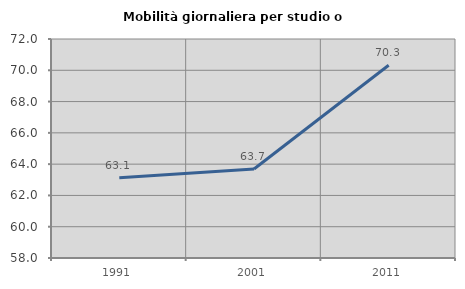
| Category | Mobilità giornaliera per studio o lavoro |
|---|---|
| 1991.0 | 63.124 |
| 2001.0 | 63.691 |
| 2011.0 | 70.32 |